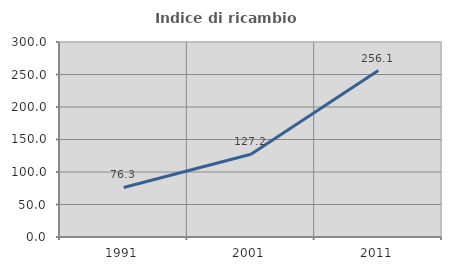
| Category | Indice di ricambio occupazionale  |
|---|---|
| 1991.0 | 76.265 |
| 2001.0 | 127.205 |
| 2011.0 | 256.106 |